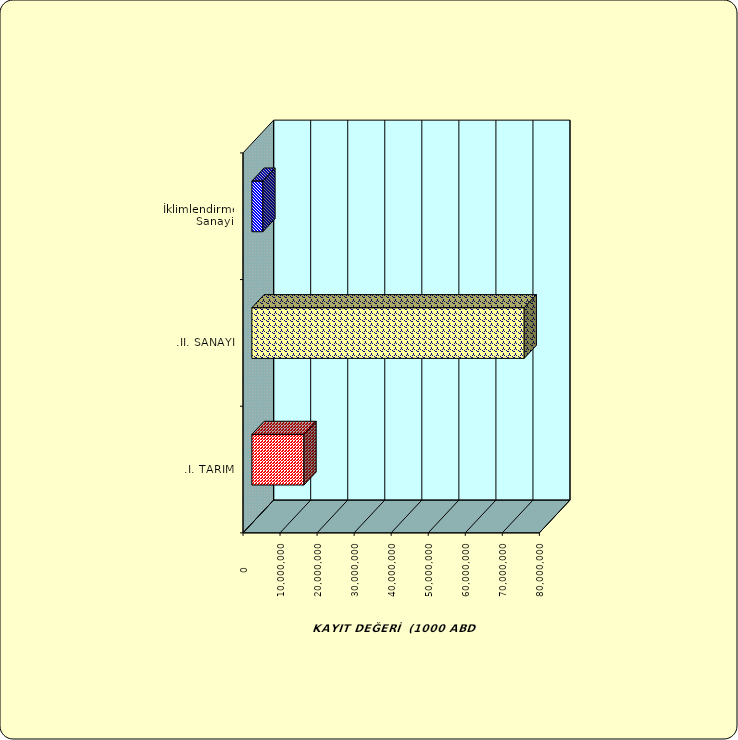
| Category | Series 0 |
|---|---|
| .I. TARIM | 14058691.798 |
| .II. SANAYİ | 73505984.877 |
|  İklimlendirme Sanayii | 2968188.757 |